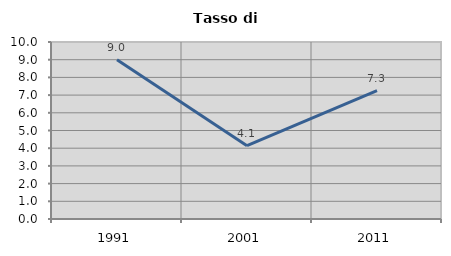
| Category | Tasso di disoccupazione   |
|---|---|
| 1991.0 | 9.003 |
| 2001.0 | 4.144 |
| 2011.0 | 7.256 |